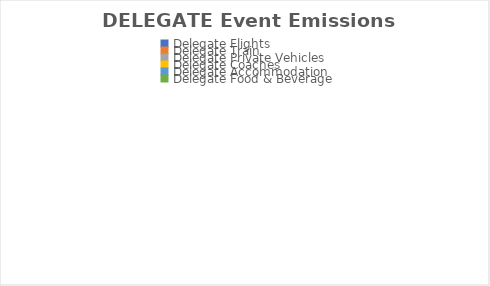
| Category | Series 0 |
|---|---|
| Delegate Flights | 0 |
| Delegate Train | 0 |
| Delegate Private Vehicles | 0 |
| Delegate Coaches | 0 |
| Delegate Accommodation | 0 |
| Delegate Food & Beverage | 0 |